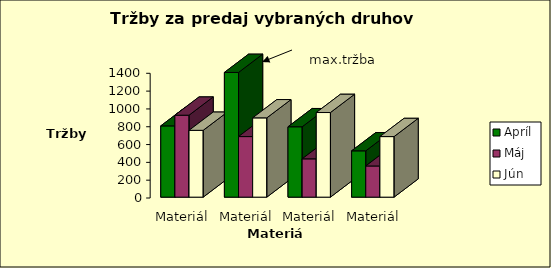
| Category | Apríl | Máj | Jún |
|---|---|---|---|
| Materiál 1 | 800 | 920 | 750 |
| Materiál 2 | 1400 | 680 | 890 |
| Materiál 3 | 790 | 430 | 950 |
| Materiál 4 | 520 | 350 | 680 |